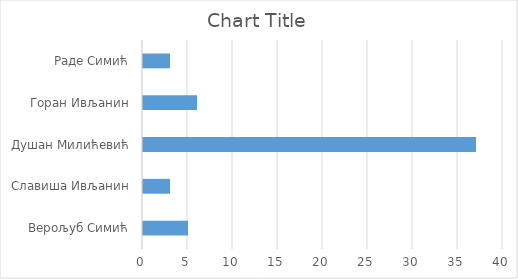
| Category | Series 0 |
|---|---|
| Верољуб Симић | 5 |
| Славиша Ивљанин | 3 |
| Душан Милићевић | 37 |
| Горан Ивљанин | 6 |
| Раде Симић | 3 |